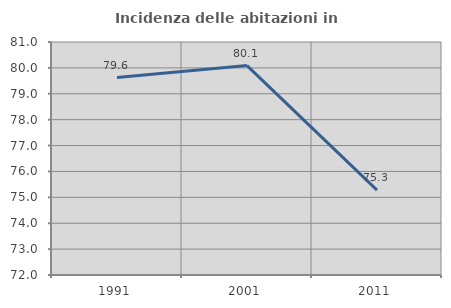
| Category | Incidenza delle abitazioni in proprietà  |
|---|---|
| 1991.0 | 79.626 |
| 2001.0 | 80.088 |
| 2011.0 | 75.276 |